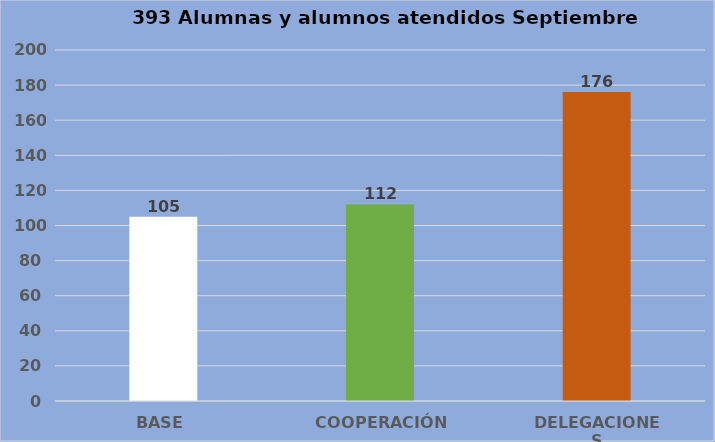
| Category | Series 0 |
|---|---|
| BASE | 105 |
| COOPERACIÓN | 112 |
| DELEGACIONES | 176 |